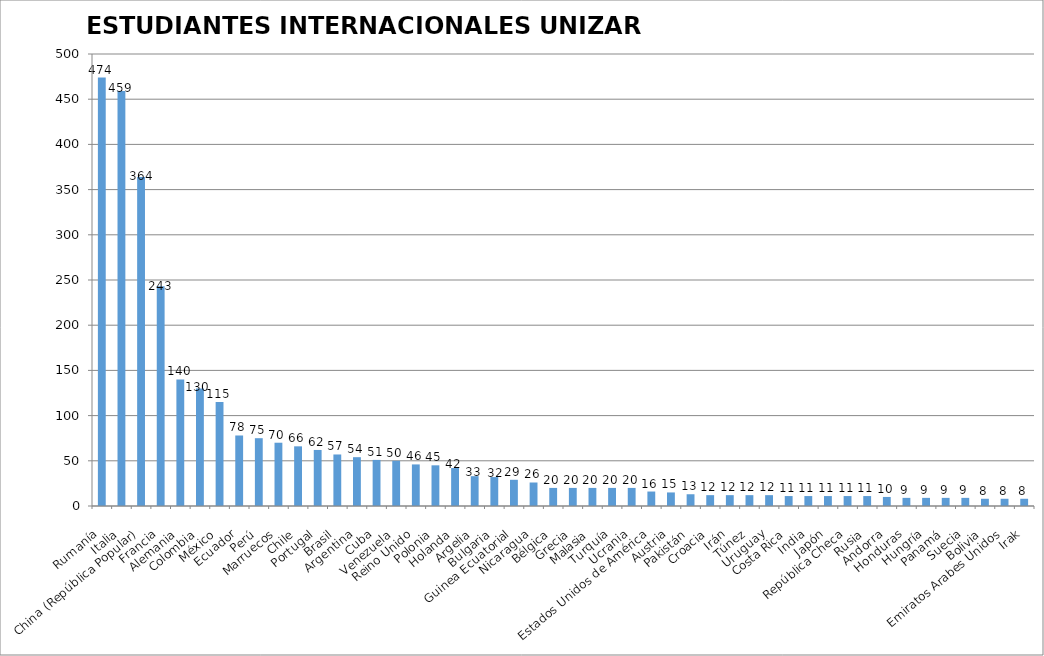
| Category | ESTUDIANTES INTERNACIONALES UNIZAR
2022-23 |
|---|---|
| Rumanía | 474 |
| Italia | 459 |
| China (República Popular) | 364 |
| Francia | 243 |
| Alemania | 140 |
| Colombia | 130 |
| México | 115 |
| Ecuador | 78 |
| Perú | 75 |
| Marruecos | 70 |
| Chile | 66 |
| Portugal | 62 |
| Brasil | 57 |
| Argentina | 54 |
| Cuba | 51 |
| Venezuela | 50 |
| Reino Unido | 46 |
| Polonia | 45 |
| Holanda | 42 |
| Argelia | 33 |
| Bulgaria | 32 |
| Guinea Ecuatorial | 29 |
| Nicaragua | 26 |
| Bélgica | 20 |
| Grecia | 20 |
| Malasia | 20 |
| Turquía | 20 |
| Ucrania | 20 |
| Estados Unidos de América | 16 |
| Austria | 15 |
| Pakistán | 13 |
| Croacia | 12 |
| Irán | 12 |
| Túnez | 12 |
| Uruguay | 12 |
| Costa Rica | 11 |
| India | 11 |
| Japón | 11 |
| República Checa | 11 |
| Rusia | 11 |
| Andorra | 10 |
| Honduras | 9 |
| Hungría | 9 |
| Panamá | 9 |
| Suecia | 9 |
| Bolivia | 8 |
| Emiratos Arabes Unidos | 8 |
| Irak | 8 |